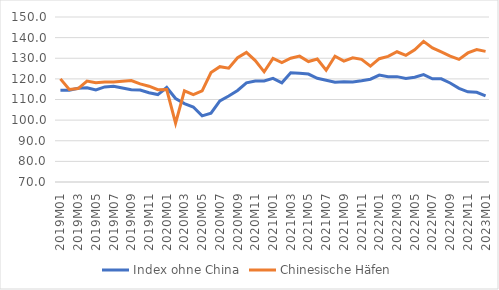
| Category | Index ohne China | Chinesische Häfen |
|---|---|---|
| 2019M01 | 114.427 | 120.001 |
| 2019M02 | 114.489 | 114.868 |
| 2019M03 | 115.41 | 115.277 |
| 2019M04 | 115.701 | 118.905 |
| 2019M05 | 114.674 | 118.134 |
| 2019M06 | 116.11 | 118.46 |
| 2019M07 | 116.468 | 118.526 |
| 2019M08 | 115.584 | 118.893 |
| 2019M09 | 114.7 | 119.185 |
| 2019M10 | 114.566 | 117.553 |
| 2019M11 | 113.274 | 116.448 |
| 2019M12 | 112.384 | 114.778 |
| 2020M01 | 115.839 | 114.807 |
| 2020M02 | 110.484 | 98.521 |
| 2020M03 | 107.998 | 114.2 |
| 2020M04 | 106.35 | 112.413 |
| 2020M05 | 102.062 | 114.172 |
| 2020M06 | 103.352 | 123.078 |
| 2020M07 | 109.317 | 125.904 |
| 2020M08 | 111.714 | 125.195 |
| 2020M09 | 114.364 | 130.234 |
| 2020M10 | 118.11 | 132.796 |
| 2020M11 | 118.987 | 128.864 |
| 2020M12 | 118.976 | 123.424 |
| 2021M01 | 120.224 | 129.93 |
| 2021M02 | 118.083 | 127.945 |
| 2021M03 | 122.916 | 130.038 |
| 2021M04 | 122.766 | 131.022 |
| 2021M05 | 122.327 | 128.394 |
| 2021M06 | 120.262 | 129.631 |
| 2021M07 | 119.357 | 124.173 |
| 2021M08 | 118.38 | 130.994 |
| 2021M09 | 118.646 | 128.627 |
| 2021M10 | 118.509 | 130.238 |
| 2021M11 | 119.114 | 129.458 |
| 2021M12 | 119.835 | 126.196 |
| 2022M01 | 121.808 | 129.794 |
| 2022M02 | 121.076 | 130.888 |
| 2022M03 | 121.087 | 133.153 |
| 2022M04 | 120.224 | 131.388 |
| 2022M05 | 120.829 | 134.119 |
| 2022M06 | 122.066 | 138.168 |
| 2022M07 | 120.039 | 135.005 |
| 2022M08 | 120.039 | 133.068 |
| 2022M09 | 117.993 | 131.025 |
| 2022M10 | 115.416 | 129.463 |
| 2022M11 | 113.707 | 132.588 |
| 2022M12 | 113.485 | 134.172 |
| 2023M01 | 111.783 | 133.344 |